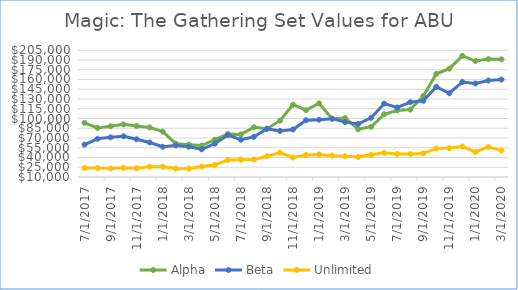
| Category | Alpha | Beta | Unlimited |
|---|---|---|---|
| 7/1/17 | 93335.5 | 59809.8 | 23829.5 |
| 8/1/17 | 85534.7 | 68769.3 | 24021 |
| 9/1/17 | 87948.7 | 70999 | 23062.7 |
| 10/1/17 | 90970.7 | 72702.1 | 24080.1 |
| 11/1/17 | 88400.3 | 68025.9 | 23187.1 |
| 12/1/17 | 86242.2 | 63147.4 | 25953.7 |
| 1/1/18 | 79857.5 | 56543.6 | 25862.2 |
| 2/1/18 | 61388.6 | 58627.5 | 23036.3 |
| 3/1/18 | 59704 | 56589.8 | 22811.2 |
| 4/1/18 | 58356.1 | 52678.7 | 26056.4 |
| 5/1/18 | 67380.9 | 61275 | 28346.1 |
| 6/1/18 | 76250 | 74517.4 | 36230.9 |
| 7/1/18 | 75493.9 | 67338.6 | 36544.5 |
| 8/1/18 | 86570 | 71881.3 | 36925 |
| 9/1/18 | 84231.8 | 84175.6 | 41888.3 |
| 10/1/18 | 96598.9 | 80859.3 | 47438.5 |
| 11/1/18 | 121289.1 | 83132.9 | 40031.4 |
| 12/1/18 | 112854.8 | 97323.7 | 43829.6 |
| 1/1/19 | 123265 | 98067.2 | 44737.6 |
| 2/1/19 | 99658.21 | 99746.4 | 42858.2 |
| 3/1/19 | 100713.6 | 94553.2 | 42042 |
| 4/1/19 | 83452.9 | 91574.3 | 40760.3 |
| 5/1/19 | 87284.2 | 101097.6 | 44082 |
| 6/1/19 | 106531.1 | 122921.6 | 47342 |
| 7/1/19 | 112286.4 | 116905.6 | 45430.8 |
| 8/1/19 | 113725.3 | 125131.9 | 45435.9 |
| 9/1/19 | 134572.5 | 127134.9 | 46410 |
| 10/1/19 | 168771.6 | 148723.6 | 53795.2 |
| 11/1/19 | 176649.1 | 138859.4 | 54445.1 |
| 12/1/19 | 196354.6 | 156176.2 | 56976.5 |
| 1/1/20 | 188372.3 | 153837.1 | 48440.7 |
| 2/1/20 | 191449.8 | 158444.1 | 56423.7 |
| 3/1/20 | 190964.4 | 159879.9 | 50562.6 |